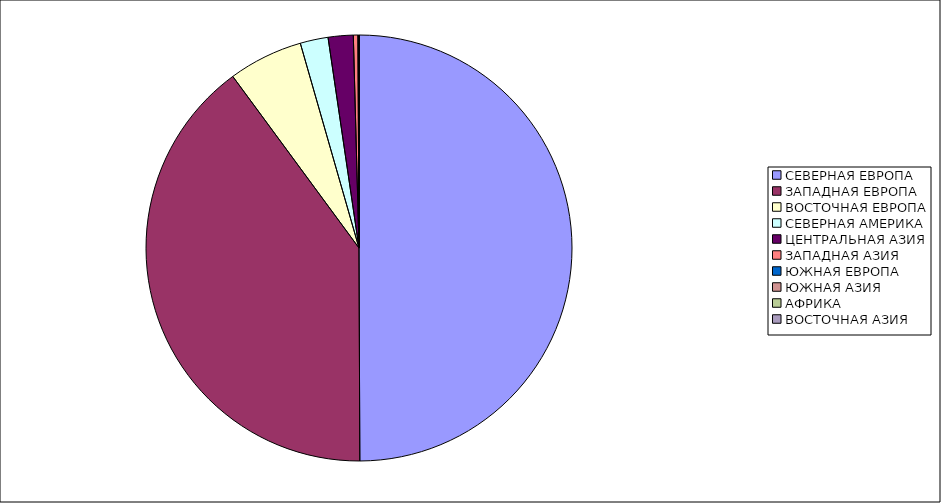
| Category | Оборот |
|---|---|
| СЕВЕРНАЯ ЕВРОПА | 49.937 |
| ЗАПАДНАЯ ЕВРОПА | 39.967 |
| ВОСТОЧНАЯ ЕВРОПА | 5.653 |
| СЕВЕРНАЯ АМЕРИКА | 2.117 |
| ЦЕНТРАЛЬНАЯ АЗИЯ | 1.9 |
| ЗАПАДНАЯ АЗИЯ | 0.345 |
| ЮЖНАЯ ЕВРОПА | 0.056 |
| ЮЖНАЯ АЗИЯ | 0.019 |
| АФРИКА | 0.003 |
| ВОСТОЧНАЯ АЗИЯ | 0.002 |